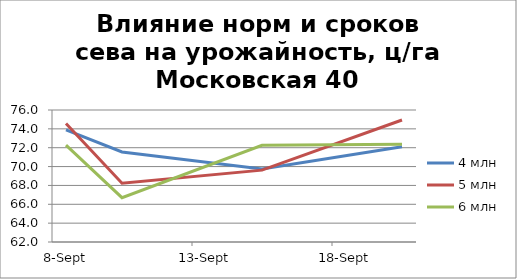
| Category | 4 млн | 5 млн | 6 млн |
|---|---|---|---|
| 2016-09-08 | 73.883 | 74.577 | 72.282 |
| 2016-09-10 | 71.547 | 68.229 | 66.701 |
| 2016-09-15 | 69.752 | 69.624 | 72.256 |
| 2016-09-20 | 72.092 | 74.936 | 72.364 |